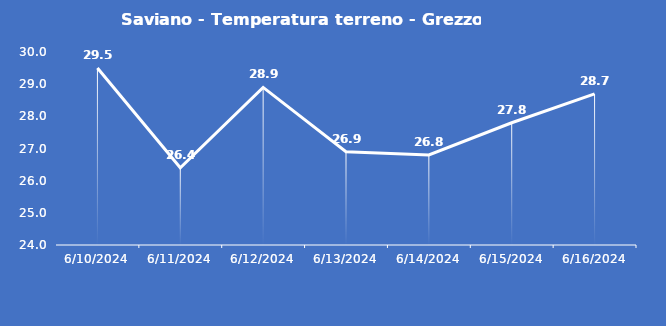
| Category | Saviano - Temperatura terreno - Grezzo (°C) |
|---|---|
| 6/10/24 | 29.5 |
| 6/11/24 | 26.4 |
| 6/12/24 | 28.9 |
| 6/13/24 | 26.9 |
| 6/14/24 | 26.8 |
| 6/15/24 | 27.8 |
| 6/16/24 | 28.7 |